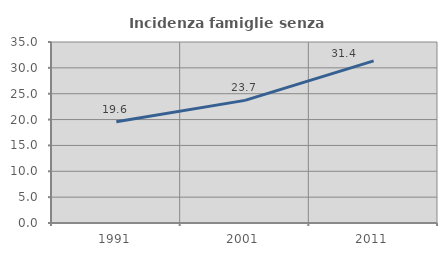
| Category | Incidenza famiglie senza nuclei |
|---|---|
| 1991.0 | 19.562 |
| 2001.0 | 23.712 |
| 2011.0 | 31.362 |